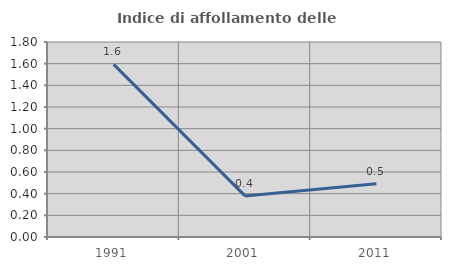
| Category | Indice di affollamento delle abitazioni  |
|---|---|
| 1991.0 | 1.594 |
| 2001.0 | 0.379 |
| 2011.0 | 0.492 |